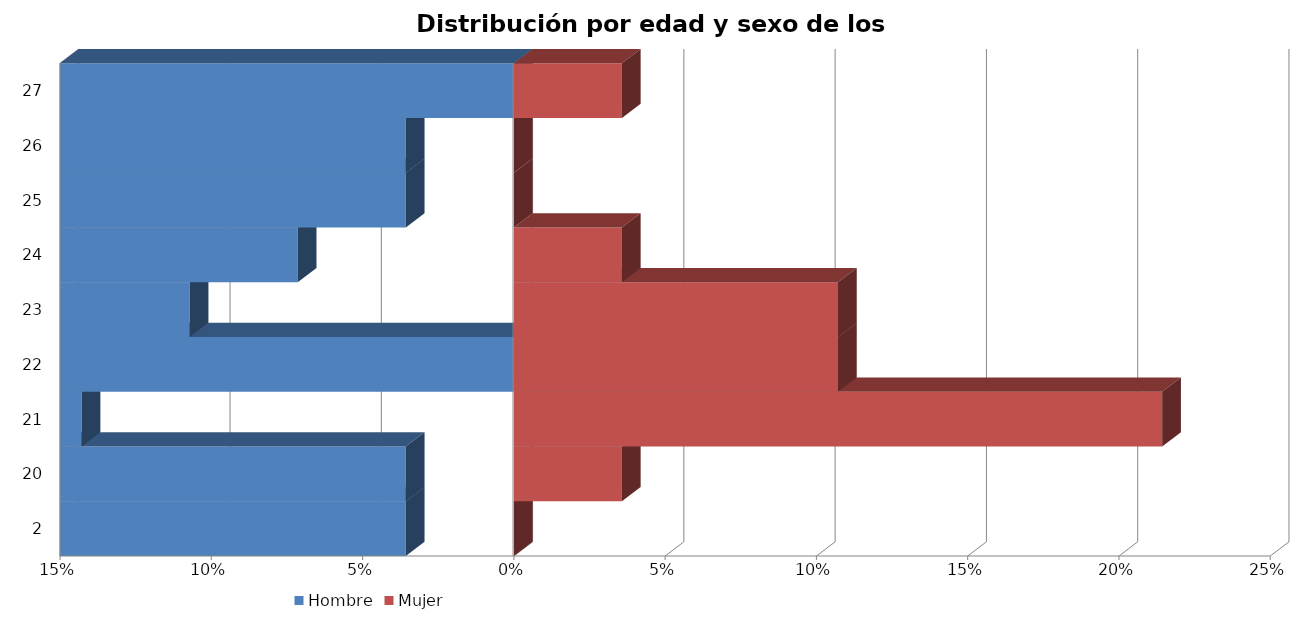
| Category | Hombre | Mujer |
|---|---|---|
| 2.0 | -0.036 | 0 |
| 20.0 | -0.036 | 0.036 |
| 21.0 | -0.143 | 0.214 |
| 22.0 | 0 | 0.107 |
| 23.0 | -0.107 | 0.107 |
| 24.0 | -0.071 | 0.036 |
| 25.0 | -0.036 | 0 |
| 26.0 | -0.036 | 0 |
| 27.0 | 0 | 0.036 |